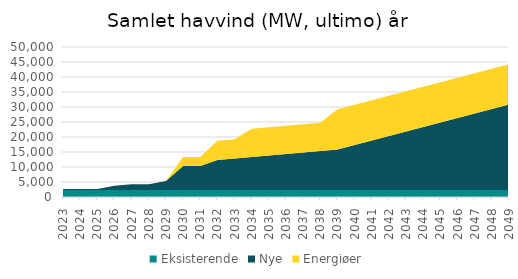
| Category | Eksisterende | Nye | Energiøer |
|---|---|---|---|
| 2023.0 | 2305.6 | 350 | 0 |
| 2024.0 | 2305.6 | 350 | 0 |
| 2025.0 | 2305.6 | 350 | 0 |
| 2026.0 | 2305.6 | 1430 | 0 |
| 2027.0 | 2305.6 | 1945 | 0 |
| 2028.0 | 2305.6 | 1945 | 0 |
| 2029.0 | 2305.6 | 3045 | 0 |
| 2030.0 | 2305.6 | 8045 | 3000 |
| 2031.0 | 2305.6 | 8045 | 3000 |
| 2032.0 | 2305.6 | 10045 | 6400 |
| 2033.0 | 2305.6 | 10545 | 6400 |
| 2034.0 | 2305.6 | 11045 | 9400 |
| 2035.0 | 2305.6 | 11545 | 9400 |
| 2036.0 | 2305.6 | 12045 | 9400 |
| 2037.0 | 2305.6 | 12545 | 9400 |
| 2038.0 | 2305.6 | 13045 | 9400 |
| 2039.0 | 2305.6 | 13545 | 13400 |
| 2040.0 | 2305.6 | 15045 | 13400 |
| 2041.0 | 2305.6 | 16545 | 13400 |
| 2042.0 | 2305.6 | 18045 | 13400 |
| 2043.0 | 2305.6 | 19545 | 13400 |
| 2044.0 | 2305.6 | 21045 | 13400 |
| 2045.0 | 2305.6 | 22545 | 13400 |
| 2046.0 | 2305.6 | 24045 | 13400 |
| 2047.0 | 2305.6 | 25545 | 13400 |
| 2048.0 | 2305.6 | 27045 | 13400 |
| 2049.0 | 2305.6 | 28545 | 13400 |